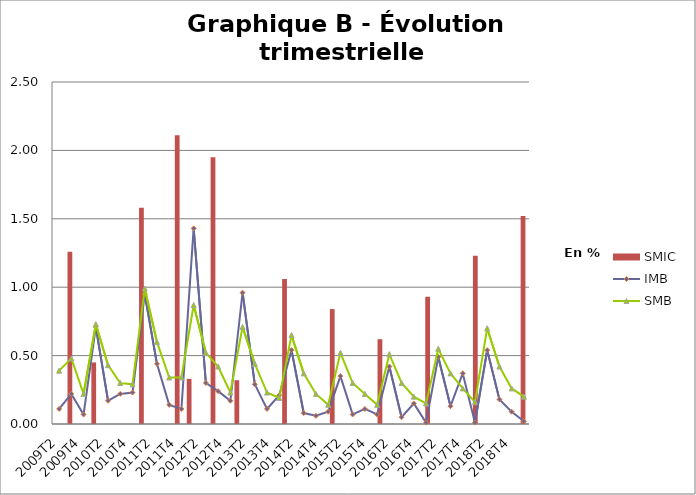
| Category | SMIC |
|---|---|
| 2009T2 | 0 |
| 2009T3 | 1.26 |
| 2009T4 | 0 |
| 2010T1 | 0.45 |
| 2010T2 | 0 |
| 2010T3 | 0 |
| 2010T4 | 0 |
| 2011T1 | 1.58 |
| 2011T2 | 0 |
| 2011T3 | 0 |
| 2011T4 | 2.11 |
| 2012T1 | 0.33 |
| 2012T2 | 0 |
| 2012T3 | 1.95 |
| 2012T4 | 0 |
| 2013T1 | 0.32 |
| 2013T2 | 0 |
| 2013T3 | 0 |
| 2013T4 | 0 |
| 2014T1 | 1.06 |
| 2014T2 | 0 |
| 2014T3 | 0 |
| 2014T4 | 0 |
| 2015T1 | 0.84 |
| 2015T2 | 0 |
| 2015T3 | 0 |
| 2015T4 | 0 |
| 2016T1 | 0.62 |
| 2016T2 | 0 |
| 2016T3 | 0 |
| 2016T4 | 0 |
| 2017T1 | 0.93 |
| 2017T2 | 0 |
| 2017T3 | 0 |
| 2017T4 | 0 |
| 2018T1 | 1.23 |
| 2018T2 | 0 |
| 2018T3 | 0 |
| 2018T4 | 0 |
| 2019T1 | 1.52 |